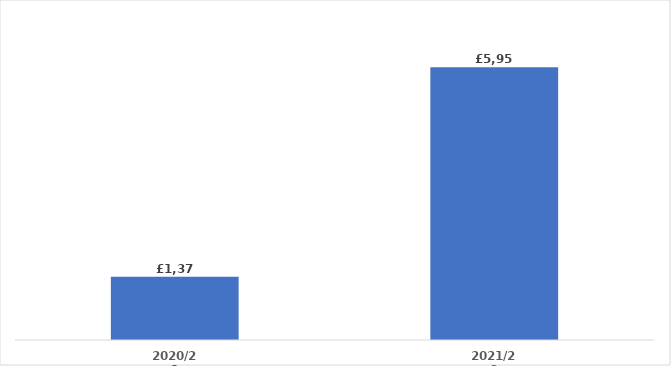
| Category | Series 0 |
|---|---|
| 2020/21 | 1378.06 |
| 2021/22 | 5950.514 |